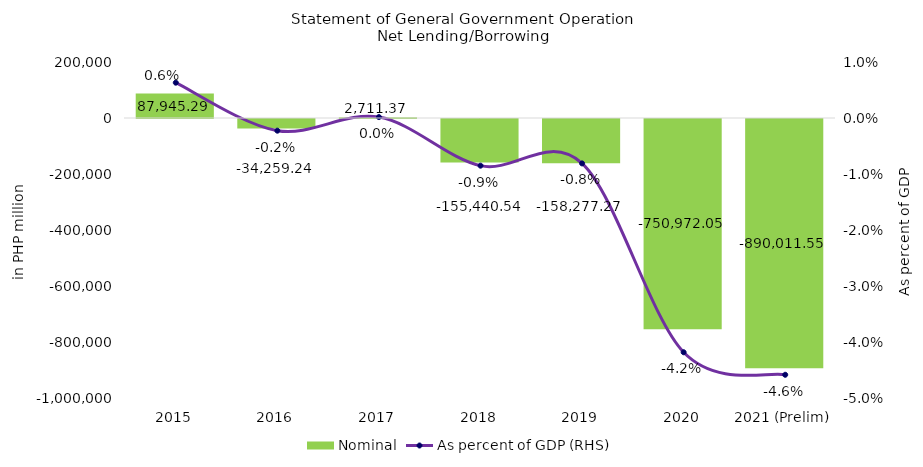
| Category | Nominal |
|---|---|
| 2015 | 87945.29 |
| 2016 | -34259.24 |
| 2017 | 2711.367 |
| 2018 | -155440.538 |
| 2019 | -158277.268 |
| 2020 | -750972.05 |
| 2021 (Prelim) | -890011.554 |